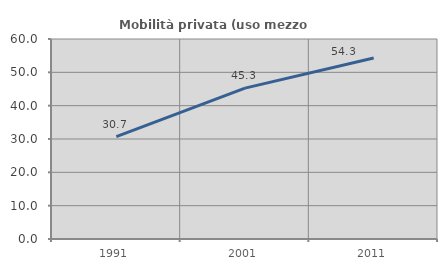
| Category | Mobilità privata (uso mezzo privato) |
|---|---|
| 1991.0 | 30.714 |
| 2001.0 | 45.262 |
| 2011.0 | 54.283 |